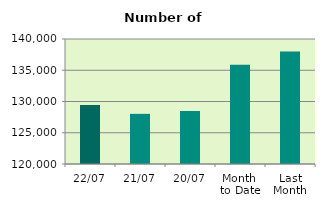
| Category | Series 0 |
|---|---|
| 22/07 | 129440 |
| 21/07 | 128022 |
| 20/07 | 128482 |
| Month 
to Date | 135889.375 |
| Last
Month | 138016.909 |